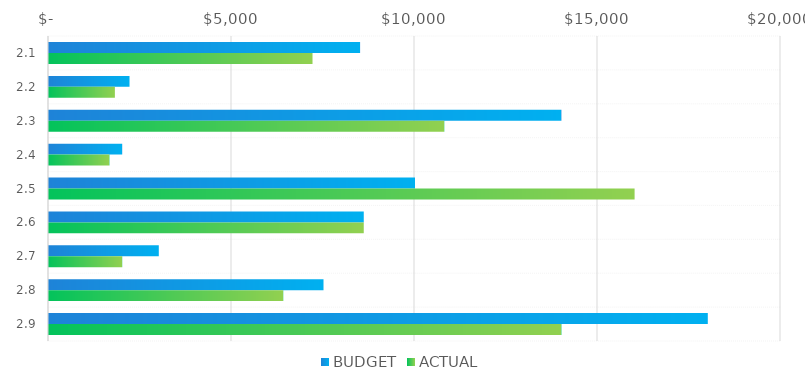
| Category | BUDGET | ACTUAL |
|---|---|---|
| 2.1 | 8500 | 7200 |
| 2.2 | 2200 | 1800 |
| 2.3 | 14000 | 10800 |
| 2.4 | 2000 | 1650 |
| 2.5 | 10000 | 16000 |
| 2.6 | 8600 | 8600 |
| 2.7 | 3000 | 2000 |
| 2.8 | 7500 | 6400 |
| 2.9 | 18000 | 14000 |